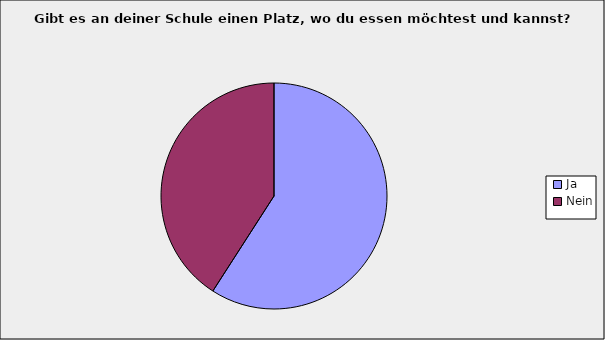
| Category | Series 0 |
|---|---|
| Ja | 0.591 |
| Nein | 0.409 |